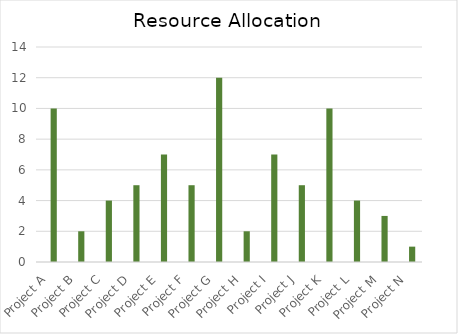
| Category | Project Name | # of Team Members |
|---|---|---|
| Project A | 0 | 10 |
| Project B | 0 | 2 |
| Project C | 0 | 4 |
| Project D | 0 | 5 |
| Project E | 0 | 7 |
| Project F | 0 | 5 |
| Project G | 0 | 12 |
| Project H | 0 | 2 |
| Project I | 0 | 7 |
| Project J | 0 | 5 |
| Project K | 0 | 10 |
| Project L | 0 | 4 |
| Project M | 0 | 3 |
| Project N | 0 | 1 |